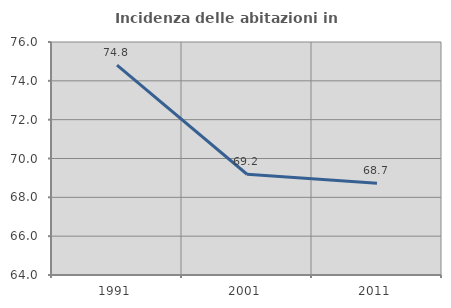
| Category | Incidenza delle abitazioni in proprietà  |
|---|---|
| 1991.0 | 74.809 |
| 2001.0 | 69.188 |
| 2011.0 | 68.731 |